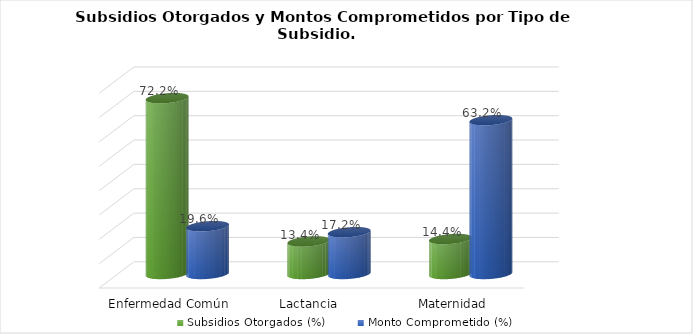
| Category | Subsidios Otorgados (%) | Monto Comprometido (%) |
|---|---|---|
| Enfermedad Común | 0.722 | 0.196 |
| Lactancia  | 0.134 | 0.172 |
| Maternidad | 0.144 | 0.632 |